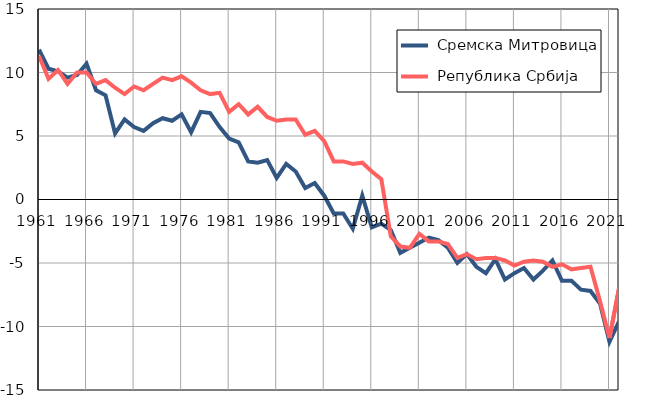
| Category |  Сремска Митровица |  Република Србија |
|---|---|---|
| 1961.0 | 11.8 | 11.3 |
| 1962.0 | 10.3 | 9.5 |
| 1963.0 | 10.1 | 10.2 |
| 1964.0 | 9.6 | 9.1 |
| 1965.0 | 9.8 | 10 |
| 1966.0 | 10.7 | 10 |
| 1967.0 | 8.6 | 9.1 |
| 1968.0 | 8.2 | 9.4 |
| 1969.0 | 5.2 | 8.8 |
| 1970.0 | 6.3 | 8.3 |
| 1971.0 | 5.7 | 8.9 |
| 1972.0 | 5.4 | 8.6 |
| 1973.0 | 6 | 9.1 |
| 1974.0 | 6.4 | 9.6 |
| 1975.0 | 6.2 | 9.4 |
| 1976.0 | 6.7 | 9.7 |
| 1977.0 | 5.3 | 9.2 |
| 1978.0 | 6.9 | 8.6 |
| 1979.0 | 6.8 | 8.3 |
| 1980.0 | 5.7 | 8.4 |
| 1981.0 | 4.8 | 6.9 |
| 1982.0 | 4.5 | 7.5 |
| 1983.0 | 3 | 6.7 |
| 1984.0 | 2.9 | 7.3 |
| 1985.0 | 3.1 | 6.5 |
| 1986.0 | 1.7 | 6.2 |
| 1987.0 | 2.8 | 6.3 |
| 1988.0 | 2.2 | 6.3 |
| 1989.0 | 0.9 | 5.1 |
| 1990.0 | 1.3 | 5.4 |
| 1991.0 | 0.3 | 4.6 |
| 1992.0 | -1.1 | 3 |
| 1993.0 | -1.1 | 3 |
| 1994.0 | -2.3 | 2.8 |
| 1995.0 | 0.3 | 2.9 |
| 1996.0 | -2.2 | 2.2 |
| 1997.0 | -1.9 | 1.6 |
| 1998.0 | -2.4 | -2.9 |
| 1999.0 | -4.2 | -3.7 |
| 2000.0 | -3.8 | -3.8 |
| 2001.0 | -3.4 | -2.7 |
| 2002.0 | -3 | -3.3 |
| 2003.0 | -3.2 | -3.3 |
| 2004.0 | -3.8 | -3.5 |
| 2005.0 | -5 | -4.6 |
| 2006.0 | -4.3 | -4.3 |
| 2007.0 | -5.3 | -4.7 |
| 2008.0 | -5.8 | -4.6 |
| 2009.0 | -4.7 | -4.6 |
| 2010.0 | -6.3 | -4.8 |
| 2011.0 | -5.8 | -5.2 |
| 2012.0 | -5.4 | -4.9 |
| 2013.0 | -6.3 | -4.8 |
| 2014.0 | -5.6 | -4.9 |
| 2015.0 | -4.8 | -5.3 |
| 2016.0 | -6.4 | -5.1 |
| 2017.0 | -6.4 | -5.5 |
| 2018.0 | -7.1 | -5.4 |
| 2019.0 | -7.2 | -5.3 |
| 2020.0 | -8.2 | -8 |
| 2021.0 | -11.2 | -10.9 |
| 2022.0 | -9.6 | -7 |